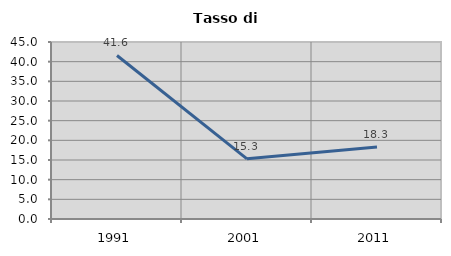
| Category | Tasso di disoccupazione   |
|---|---|
| 1991.0 | 41.573 |
| 2001.0 | 15.294 |
| 2011.0 | 18.329 |